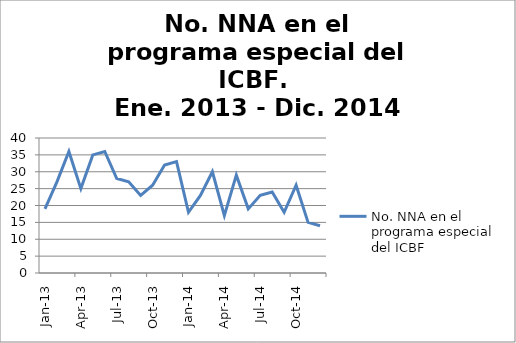
| Category | No. NNA en el programa especial del ICBF
 |
|---|---|
| 2013-01-01 | 19 |
| 2013-02-01 | 27 |
| 2013-03-01 | 36 |
| 2013-04-01 | 25 |
| 2013-05-01 | 35 |
| 2013-06-01 | 36 |
| 2013-07-01 | 28 |
| 2013-08-01 | 27 |
| 2013-09-01 | 23 |
| 2013-10-01 | 26 |
| 2013-11-01 | 32 |
| 2013-12-01 | 33 |
| 2014-01-01 | 18 |
| 2014-02-01 | 23 |
| 2014-03-01 | 30 |
| 2014-04-01 | 17 |
| 2014-05-01 | 29 |
| 2014-06-01 | 19 |
| 2014-07-01 | 23 |
| 2014-08-01 | 24 |
| 2014-09-01 | 18 |
| 2014-10-01 | 26 |
| 2014-11-01 | 15 |
| 2014-12-01 | 14 |